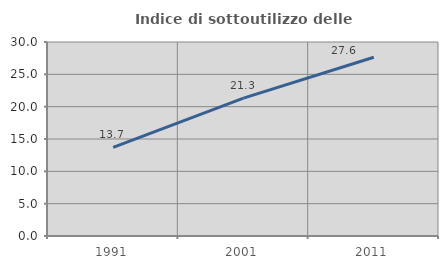
| Category | Indice di sottoutilizzo delle abitazioni  |
|---|---|
| 1991.0 | 13.713 |
| 2001.0 | 21.32 |
| 2011.0 | 27.648 |